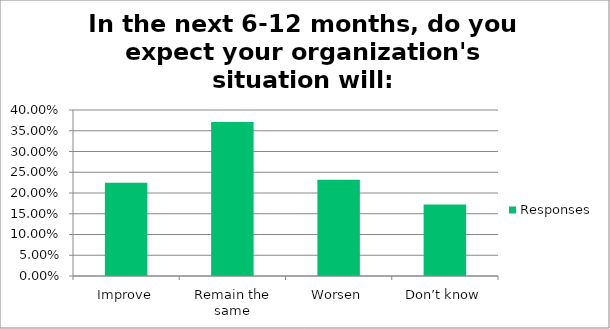
| Category | Responses |
|---|---|
| Improve | 0.224 |
| Remain the same | 0.371 |
| Worsen | 0.232 |
| Don’t know | 0.172 |